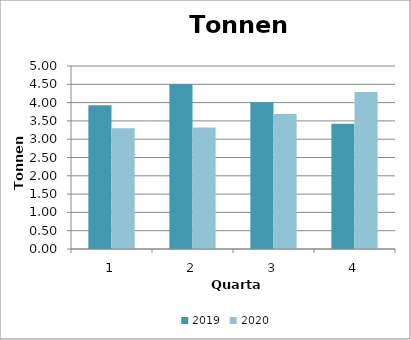
| Category | 2019 | 2020 |
|---|---|---|
| 0 | 3.93 | 3.3 |
| 1 | 4.51 | 3.32 |
| 2 | 4.01 | 3.69 |
| 3 | 3.42 | 4.29 |